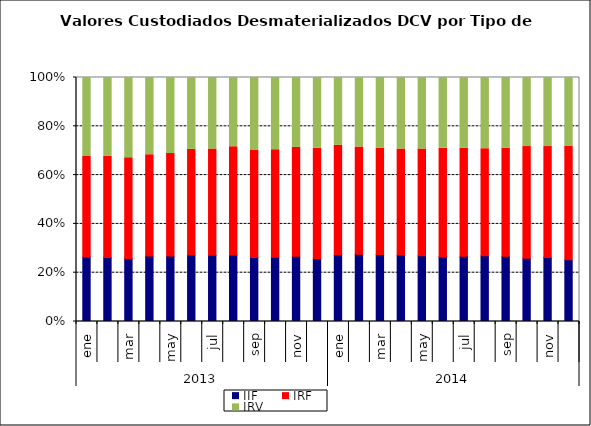
| Category | IIF | IRF | IRV |
|---|---|---|---|
| 0 | 81170.83 | 127081.919 | 98829.931 |
| 1900-01-01 | 79839.053 | 126045.699 | 98462.561 |
| 1900-01-02 | 78761.309 | 125861.366 | 100231.491 |
| 1900-01-03 | 83465.037 | 128907.337 | 98211.779 |
| 1900-01-04 | 78146.718 | 122273.492 | 90743.924 |
| 1900-01-05 | 76965.203 | 122620.135 | 83206.996 |
| 1900-01-06 | 75705.094 | 121074.576 | 81675.524 |
| 1900-01-07 | 76454.342 | 124205.399 | 79486.55 |
| 1900-01-08 | 75689.196 | 126922.9 | 85843.524 |
| 1900-01-09 | 75762.957 | 126506.803 | 84955.045 |
| 1900-01-10 | 73416.27 | 122390.016 | 78541.4 |
| 1900-01-11 | 70158.893 | 123578.501 | 79143.198 |
| 1900-01-12 | 71304.608 | 116905.607 | 72428.139 |
| 1900-01-13 | 72797.002 | 116027.828 | 75132.114 |
| 1900-01-14 | 73424.667 | 116679.392 | 77731.156 |
| 1900-01-15 | 72028.533 | 115064.201 | 77628.794 |
| 1900-01-16 | 73950.393 | 119889.261 | 80406.314 |
| 1900-01-17 | 72092.502 | 121561.686 | 78989.531 |
| 1900-01-18 | 71285.955 | 117899.51 | 77341.332 |
| 1900-01-19 | 70483.419 | 115155.469 | 76395.904 |
| 1900-01-20 | 69552.801 | 115362.038 | 75568.341 |
| 1900-01-21 | 70744.772 | 125159.405 | 77399.09 |
| 1900-01-22 | 70097.098 | 121098.821 | 75561.326 |
| 1900-01-23 | 66090.561 | 122122.709 | 73395.251 |